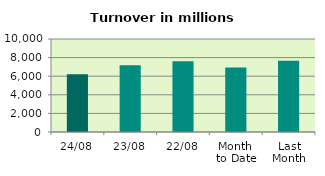
| Category | Series 0 |
|---|---|
| 24/08 | 6215.098 |
| 23/08 | 7181.162 |
| 22/08 | 7612.231 |
| Month 
to Date | 6945.003 |
| Last
Month | 7648.819 |